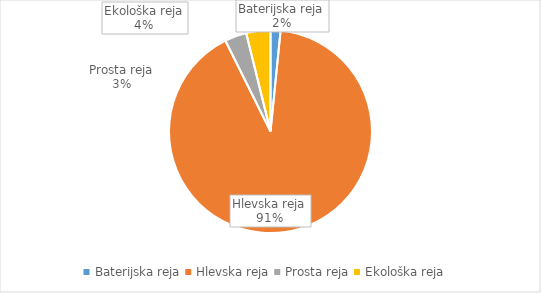
| Category | Količina kosov jajc |
|---|---|
| Baterijska reja | 46880 |
| Hlevska reja | 2692736 |
| Prosta reja | 102769 |
| Ekološka reja | 113968 |